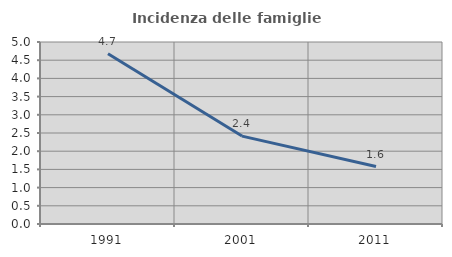
| Category | Incidenza delle famiglie numerose |
|---|---|
| 1991.0 | 4.675 |
| 2001.0 | 2.415 |
| 2011.0 | 1.58 |